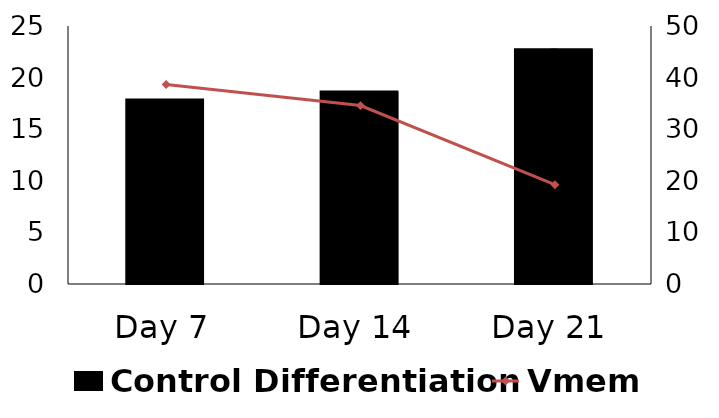
| Category |  Control Differentiation |
|---|---|
| Day 7 | 17869.333 |
| Day 14 | 18646.667 |
| Day 21 | 22744.667 |